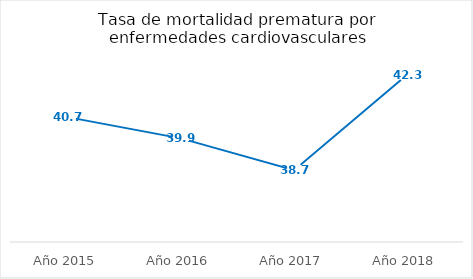
| Category | Tasa de mortalidad prematura por enfermedades cardiovasculares |
|---|---|
| Año 2015 | 40.7 |
| Año 2016 | 39.9 |
| Año 2017 | 38.7 |
| Año 2018 | 42.3 |